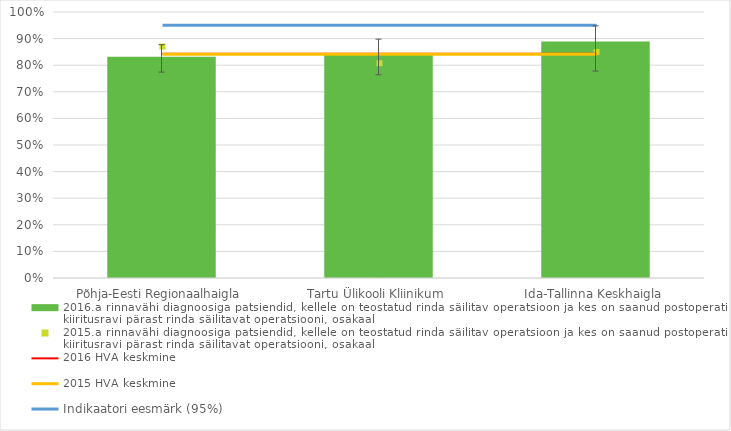
| Category | 2016.a rinnavähi diagnoosiga patsiendid, kellele on teostatud rinda säilitav operatsioon ja kes on saanud postoperatiivset kiiritusravi pärast rinda säilitavat operatsiooni, osakaal |
|---|---|
| Põhja-Eesti Regionaalhaigla | 0.832 |
| Tartu Ülikooli Kliinikum | 0.842 |
| Ida-Tallinna Keskhaigla | 0.889 |